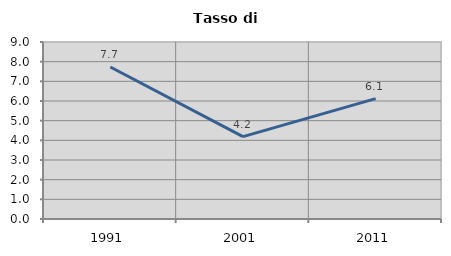
| Category | Tasso di disoccupazione   |
|---|---|
| 1991.0 | 7.728 |
| 2001.0 | 4.191 |
| 2011.0 | 6.118 |